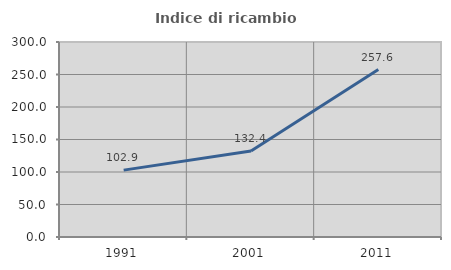
| Category | Indice di ricambio occupazionale  |
|---|---|
| 1991.0 | 102.882 |
| 2001.0 | 132.362 |
| 2011.0 | 257.617 |